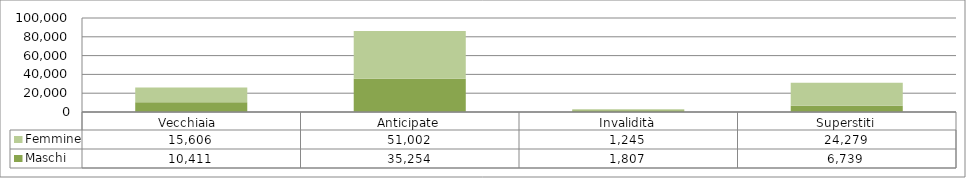
| Category | Maschi | Femmine |
|---|---|---|
| Vecchiaia  | 10411 | 15606 |
| Anticipate | 35254 | 51002 |
| Invalidità | 1807 | 1245 |
| Superstiti | 6739 | 24279 |